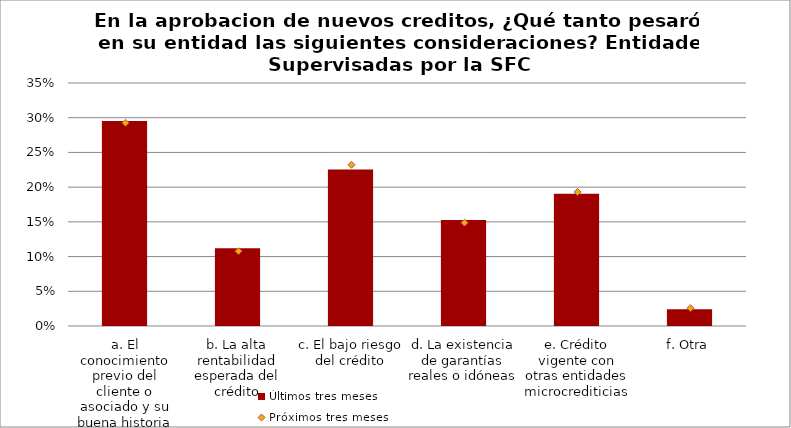
| Category | Últimos tres meses |
|---|---|
| a. El conocimiento previo del cliente o asociado y su buena historia de crédito | 0.295 |
| b. La alta rentabilidad esperada del crédito | 0.112 |
| c. El bajo riesgo del crédito | 0.225 |
| d. La existencia de garantías reales o idóneas | 0.153 |
| e. Crédito vigente con otras entidades microcrediticias | 0.19 |
| f. Otra | 0.024 |